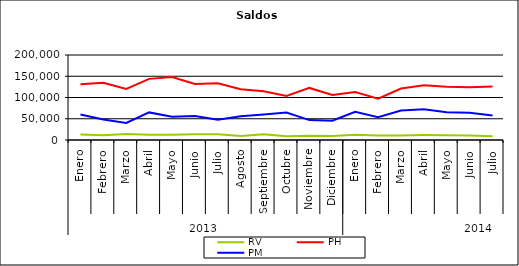
| Category | RV | PH | PM |
|---|---|---|---|
| 0 | 12966.437 | 131380.856 | 59975.653 |
| 1 | 11432.271 | 134655.891 | 48046.612 |
| 2 | 14149.543 | 120343.782 | 40297.909 |
| 3 | 12403.249 | 143830.507 | 64946.114 |
| 4 | 12323.134 | 148139.781 | 54592.514 |
| 5 | 13759.976 | 131634.752 | 56652.701 |
| 6 | 13256.014 | 133515.147 | 47907.561 |
| 7 | 9335.8 | 119600.732 | 55860.576 |
| 8 | 13362.811 | 114843.232 | 59771.51 |
| 9 | 9080.978 | 103607.627 | 64696.186 |
| 10 | 9993.913 | 122533.872 | 46801.148 |
| 11 | 9303.464 | 105747.395 | 45455.331 |
| 12 | 12145.055 | 112918.262 | 66200.17 |
| 13 | 10742.048 | 97242.789 | 53817.215 |
| 14 | 10795.854 | 121097.504 | 69409.543 |
| 15 | 11604.091 | 128798.176 | 72161.549 |
| 16 | 11264.83 | 125268.689 | 65570.493 |
| 17 | 10724.052 | 123922.82 | 64054.99 |
| 18 | 9051.652 | 126086.706 | 57402.892 |